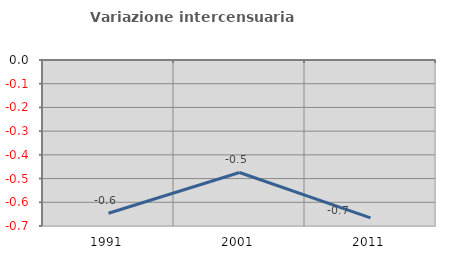
| Category | Variazione intercensuaria annua |
|---|---|
| 1991.0 | -0.646 |
| 2001.0 | -0.474 |
| 2011.0 | -0.666 |